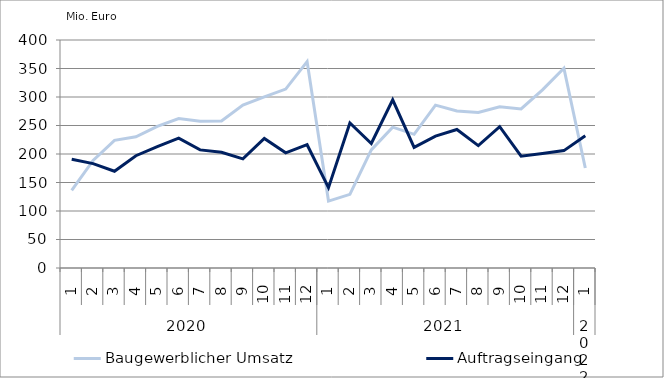
| Category | Baugewerblicher Umsatz | Auftragseingang |
|---|---|---|
| 0 | 136135.432 | 190647.086 |
| 1 | 188682.361 | 183141.14 |
| 2 | 224009.315 | 169770.009 |
| 3 | 230172.252 | 196979.845 |
| 4 | 248410.714 | 212955.83 |
| 5 | 262078.128 | 227853.487 |
| 6 | 257360.37 | 207209.188 |
| 7 | 257932.168 | 202976.091 |
| 8 | 285866.269 | 191463.844 |
| 9 | 300164.57 | 227245.467 |
| 10 | 313922.518 | 202060.636 |
| 11 | 362040.738 | 216296.504 |
| 12 | 117421.805 | 141020.655 |
| 13 | 129162.55 | 254416.876 |
| 14 | 207280.837 | 218451.405 |
| 15 | 247094.279 | 295077.868 |
| 16 | 234515.312 | 211696.129 |
| 17 | 285732.845 | 231455.155 |
| 18 | 275480.885 | 242932.505 |
| 19 | 272787.524 | 214636.944 |
| 20 | 282850.254 | 247827.991 |
| 21 | 279173.21 | 196069.238 |
| 22 | 312511.437 | 201015.897 |
| 23 | 350582.01 | 205949.991 |
| 24 | 175456.852 | 232178.255 |